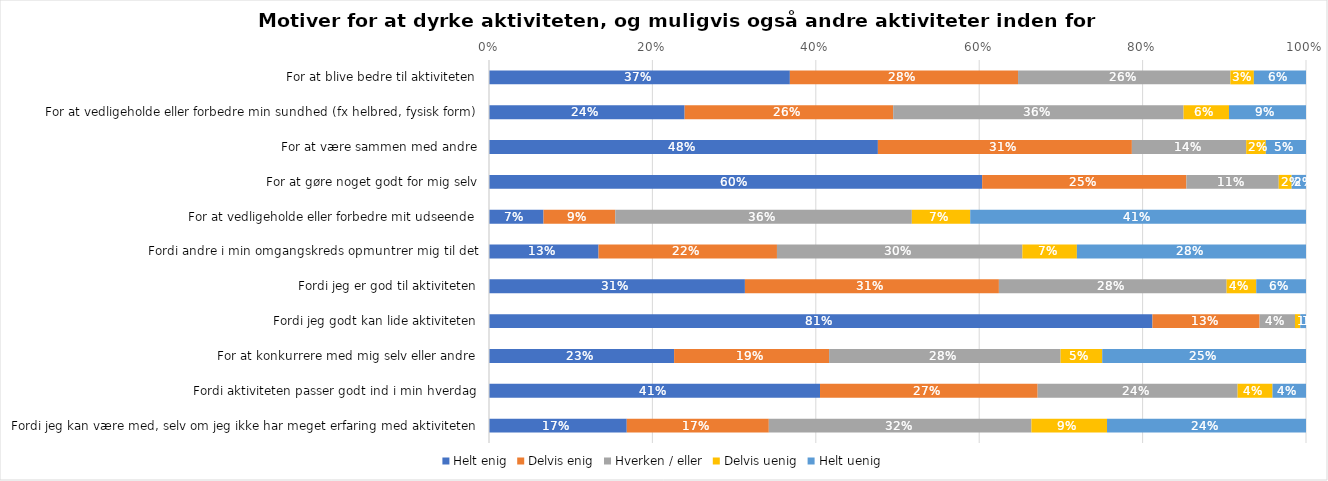
| Category | Helt enig | Delvis enig | Hverken / eller | Delvis uenig | Helt uenig |
|---|---|---|---|---|---|
| For at blive bedre til aktiviteten | 0.368 | 0.279 | 0.26 | 0.029 | 0.064 |
| For at vedligeholde eller forbedre min sundhed (fx helbred, fysisk form) | 0.239 | 0.255 | 0.355 | 0.056 | 0.094 |
| For at være sammen med andre | 0.476 | 0.311 | 0.14 | 0.024 | 0.049 |
| For at gøre noget godt for mig selv | 0.604 | 0.25 | 0.113 | 0.016 | 0.018 |
| For at vedligeholde eller forbedre mit udseende | 0.067 | 0.088 | 0.363 | 0.071 | 0.411 |
| Fordi andre i min omgangskreds opmuntrer mig til det | 0.134 | 0.218 | 0.3 | 0.067 | 0.28 |
| Fordi jeg er god til aktiviteten | 0.313 | 0.311 | 0.279 | 0.036 | 0.061 |
| Fordi jeg godt kan lide aktiviteten | 0.812 | 0.131 | 0.043 | 0.006 | 0.007 |
| For at konkurrere med mig selv eller andre | 0.227 | 0.19 | 0.283 | 0.051 | 0.249 |
| Fordi aktiviteten passer godt ind i min hverdag | 0.405 | 0.266 | 0.245 | 0.043 | 0.041 |
| Fordi jeg kan være med, selv om jeg ikke har meget erfaring med aktiviteten | 0.169 | 0.174 | 0.321 | 0.093 | 0.244 |